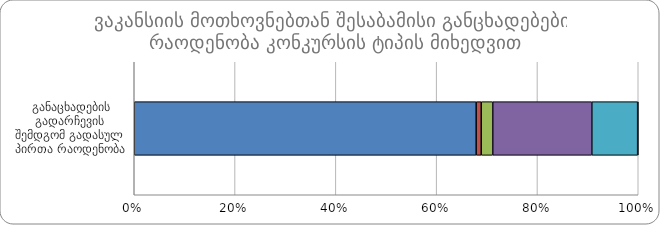
| Category |  ღია კონკურსი |  დახურული კონკურსი |  შიდა კონკურსი |  გამარტივებული კონკურსი |  სტაჟირება |  სხვა |
|---|---|---|---|---|---|---|
|  განაცხადების გადარჩევის შემდგომ გადასულ პირთა რაოდენობა | 22022 | 326 | 743 | 6381 | 2953 | 38 |